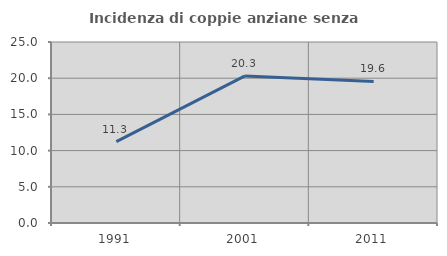
| Category | Incidenza di coppie anziane senza figli  |
|---|---|
| 1991.0 | 11.25 |
| 2001.0 | 20.312 |
| 2011.0 | 19.553 |